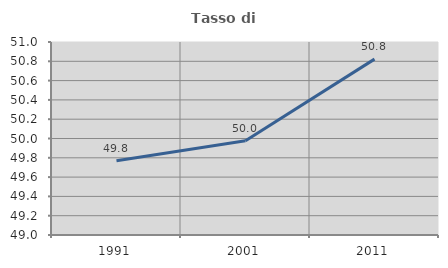
| Category | Tasso di occupazione   |
|---|---|
| 1991.0 | 49.769 |
| 2001.0 | 49.977 |
| 2011.0 | 50.823 |